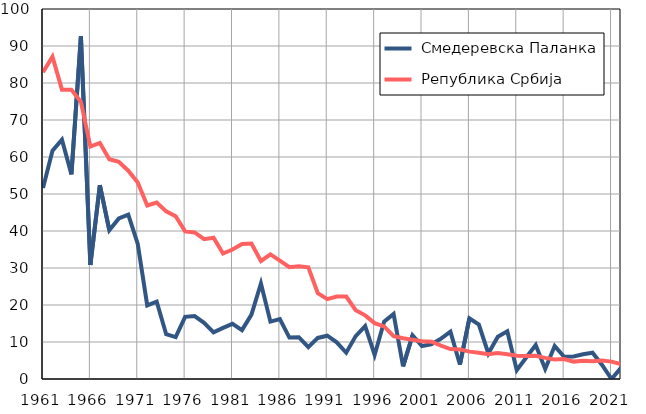
| Category |  Смедеревска Паланка |  Република Србија |
|---|---|---|
| 1961.0 | 51.6 | 82.9 |
| 1962.0 | 61.7 | 87.1 |
| 1963.0 | 64.7 | 78.2 |
| 1964.0 | 55.3 | 78.2 |
| 1965.0 | 92.6 | 74.9 |
| 1966.0 | 30.8 | 62.8 |
| 1967.0 | 52.4 | 63.8 |
| 1968.0 | 40.2 | 59.4 |
| 1969.0 | 43.4 | 58.7 |
| 1970.0 | 44.4 | 56.3 |
| 1971.0 | 36.5 | 53.1 |
| 1972.0 | 19.9 | 46.9 |
| 1973.0 | 20.9 | 47.7 |
| 1974.0 | 12.1 | 45.3 |
| 1975.0 | 11.3 | 44 |
| 1976.0 | 16.8 | 39.9 |
| 1977.0 | 17 | 39.6 |
| 1978.0 | 15.2 | 37.8 |
| 1979.0 | 12.6 | 38.2 |
| 1980.0 | 13.8 | 33.9 |
| 1981.0 | 14.9 | 35 |
| 1982.0 | 13.2 | 36.5 |
| 1983.0 | 17.4 | 36.6 |
| 1984.0 | 25.8 | 31.9 |
| 1985.0 | 15.5 | 33.7 |
| 1986.0 | 16.2 | 32 |
| 1987.0 | 11.2 | 30.2 |
| 1988.0 | 11.3 | 30.5 |
| 1989.0 | 8.6 | 30.2 |
| 1990.0 | 11.1 | 23.2 |
| 1991.0 | 11.7 | 21.6 |
| 1992.0 | 9.9 | 22.3 |
| 1993.0 | 7.1 | 22.3 |
| 1994.0 | 11.6 | 18.6 |
| 1995.0 | 14.3 | 17.2 |
| 1996.0 | 6.5 | 15.1 |
| 1997.0 | 15.5 | 14.2 |
| 1998.0 | 17.6 | 11.6 |
| 1999.0 | 3.4 | 11 |
| 2000.0 | 11.8 | 10.6 |
| 2001.0 | 8.9 | 10.2 |
| 2002.0 | 9.4 | 10.1 |
| 2003.0 | 10.9 | 9 |
| 2004.0 | 12.8 | 8.1 |
| 2005.0 | 3.9 | 8 |
| 2006.0 | 16.4 | 7.4 |
| 2007.0 | 14.7 | 7.1 |
| 2008.0 | 6.9 | 6.7 |
| 2009.0 | 11.4 | 7 |
| 2010.0 | 12.9 | 6.7 |
| 2011.0 | 2.4 | 6.3 |
| 2012.0 | 5.8 | 6.2 |
| 2013.0 | 9.2 | 6.3 |
| 2014.0 | 2.7 | 5.7 |
| 2015.0 | 8.9 | 5.3 |
| 2016.0 | 6 | 5.4 |
| 2017.0 | 6.1 | 4.7 |
| 2018.0 | 6.7 | 4.9 |
| 2019.0 | 7.1 | 4.8 |
| 2020.0 | 3.8 | 5 |
| 2021.0 | 0 | 4.7 |
| 2022.0 | 3 | 4 |